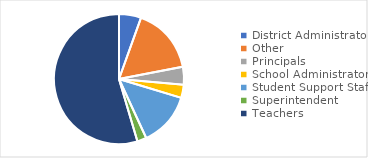
| Category | Series 0 |
|---|---|
| District Administrator | 212 |
| Other | 636 |
| Principals | 172 |
| School Administrators | 126 |
| Student Support Staff | 519 |
| Superintendent | 89 |
| Teachers | 2107 |